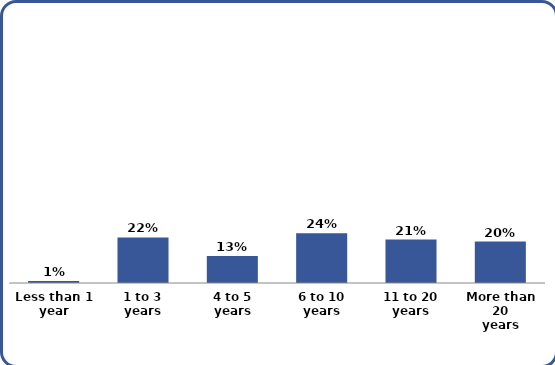
| Category | Series 0 |
|---|---|
| Less than 1
year | 0.01 |
| 1 to 3
years | 0.22 |
| 4 to 5
years | 0.13 |
| 6 to 10
years | 0.24 |
| 11 to 20
years | 0.21 |
| More than 20
years | 0.2 |